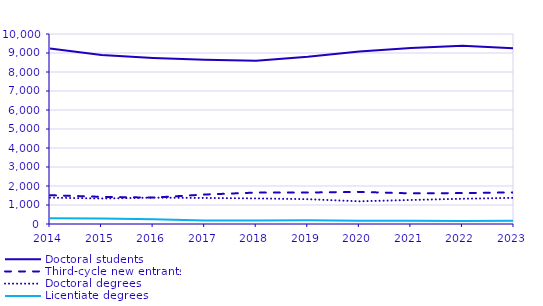
| Category | Doctoral students | Third-cycle new entrants | Doctoral degrees | Licentiate degrees |
|---|---|---|---|---|
| 2014.0 | 9242 | 1516 | 1386 | 309 |
| 2015.0 | 8889 | 1430 | 1342 | 287 |
| 2016.0 | 8735 | 1388 | 1387 | 254 |
| 2017.0 | 8641 | 1551 | 1370 | 181 |
| 2018.0 | 8597 | 1654 | 1348 | 185 |
| 2019.0 | 8804 | 1657 | 1306 | 195 |
| 2020.0 | 9075 | 1689 | 1195 | 177 |
| 2021.0 | 9268 | 1613 | 1265 | 166 |
| 2022.0 | 9381 | 1627 | 1328 | 154 |
| 2023.0 | 9249 | 1663 | 1377 | 177 |